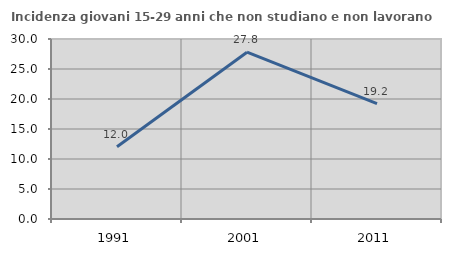
| Category | Incidenza giovani 15-29 anni che non studiano e non lavorano  |
|---|---|
| 1991.0 | 12.028 |
| 2001.0 | 27.796 |
| 2011.0 | 19.238 |